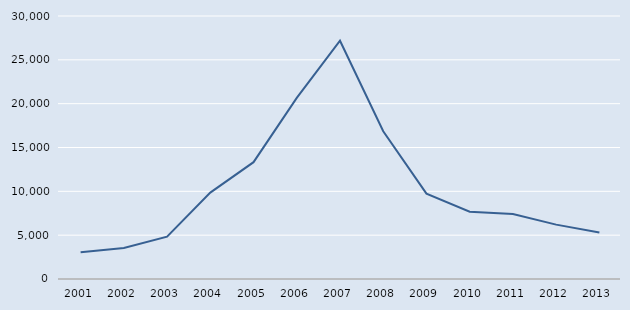
| Category | Series 0 |
|---|---|
| 2001.0 | 3057 |
| 2002.0 | 3538 |
| 2003.0 | 4825 |
| 2004.0 | 9851 |
| 2005.0 | 13327 |
| 2006.0 | 20658 |
| 2007.0 | 27178 |
| 2008.0 | 16857 |
| 2009.0 | 9739 |
| 2010.0 | 7678 |
| 2011.0 | 7424 |
| 2012.0 | 6201 |
| 2013.0 | 5302 |